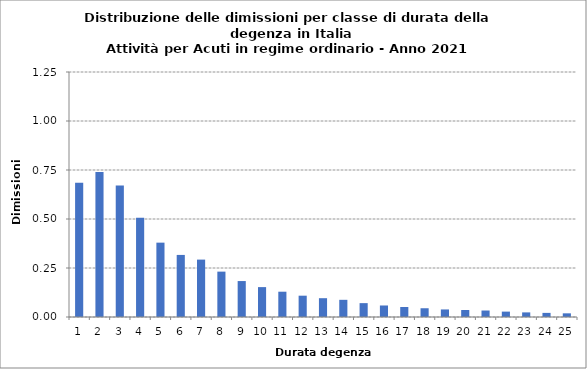
| Category | Series 0 |
|---|---|
| 1.0 | 684992 |
| 2.0 | 739242 |
| 3.0 | 671047 |
| 4.0 | 506376 |
| 5.0 | 379366 |
| 6.0 | 316725 |
| 7.0 | 292829 |
| 8.0 | 231479 |
| 9.0 | 183404 |
| 10.0 | 152506 |
| 11.0 | 129051 |
| 12.0 | 108742 |
| 13.0 | 95954 |
| 14.0 | 87641 |
| 15.0 | 70737 |
| 16.0 | 58749 |
| 17.0 | 51145 |
| 18.0 | 44657 |
| 19.0 | 38552 |
| 20.0 | 35602 |
| 21.0 | 33101 |
| 22.0 | 27486 |
| 23.0 | 23542 |
| 24.0 | 21003 |
| 25.0 | 18725 |